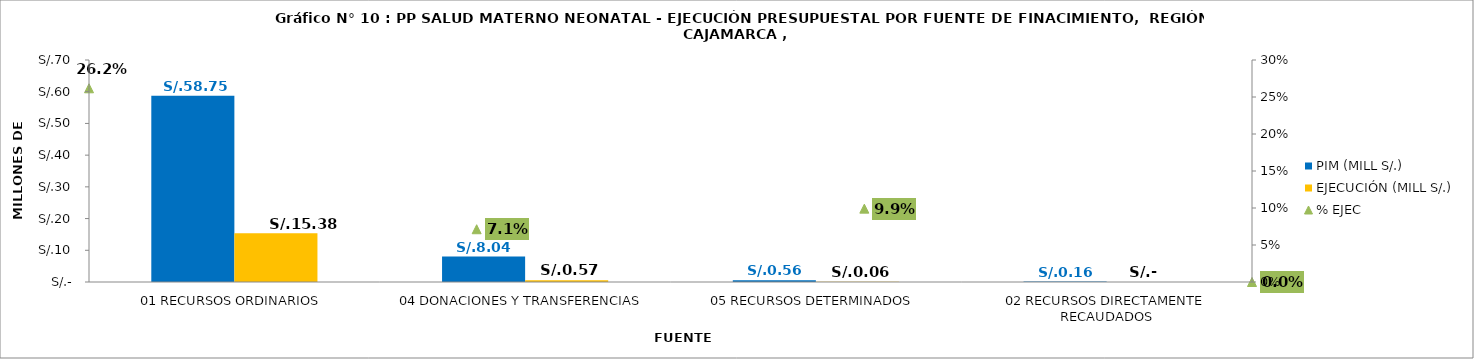
| Category | PIM (MILL S/.) | EJECUCIÓN (MILL S/.) |
|---|---|---|
| 01 RECURSOS ORDINARIOS | 58.751 | 15.379 |
| 04 DONACIONES Y TRANSFERENCIAS | 8.039 | 0.573 |
| 05 RECURSOS DETERMINADOS | 0.559 | 0.055 |
| 02 RECURSOS DIRECTAMENTE RECAUDADOS | 0.157 | 0 |